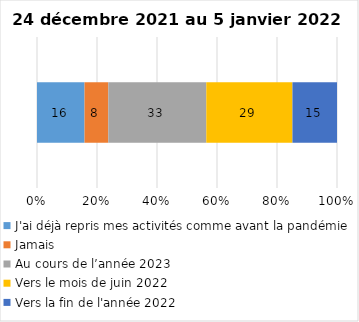
| Category | J'ai déjà repris mes activités comme avant la pandémie | Jamais | Au cours de l’année 2023 | Vers le mois de juin 2022 | Vers la fin de l'année 2022 |
|---|---|---|---|---|---|
| 0 | 16 | 8 | 33 | 29 | 15 |